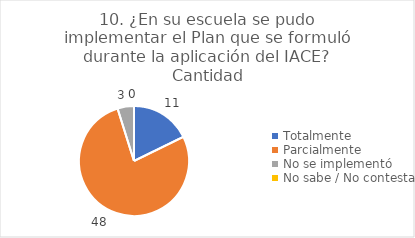
| Category | 10. ¿En su escuela se pudo implementar el Plan que se formuló durante la aplicación del IACE? |
|---|---|
| Totalmente  | 0.177 |
| Parcialmente  | 0.774 |
| No se implementó  | 0.048 |
| No sabe / No contesta | 0 |